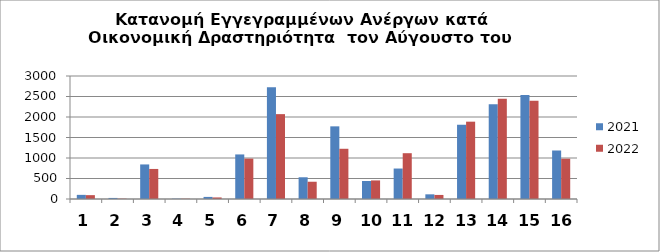
| Category | 2021 | 2022 |
|---|---|---|
| 0 | 101 | 94 |
| 1 | 26 | 8 |
| 2 | 843 | 733 |
| 3 | 8 | 7 |
| 4 | 51 | 38 |
| 5 | 1087 | 985 |
| 6 | 2726 | 2070 |
| 7 | 530 | 421 |
| 8 | 1772 | 1225 |
| 9 | 439 | 453 |
| 10 | 743 | 1117 |
| 11 | 114 | 99 |
| 12 | 1811 | 1886 |
| 13 | 2311 | 2446 |
| 14 | 2536 | 2396 |
| 15 | 1183 | 983 |